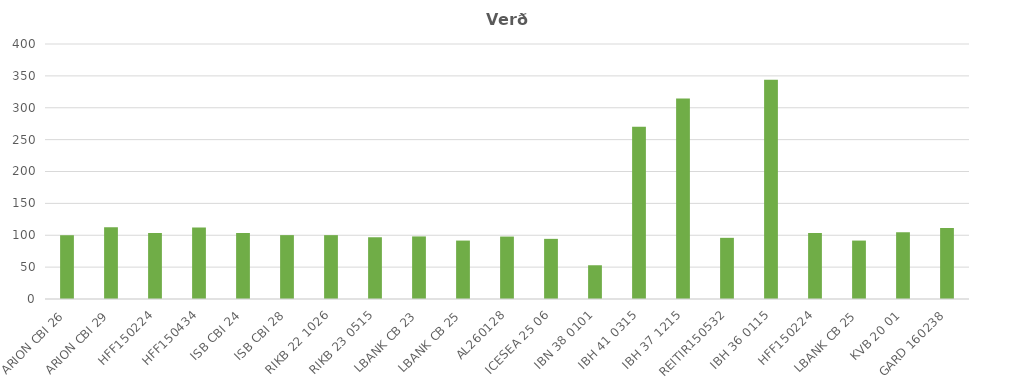
| Category | Verð |
|---|---|
| ARION CBI 26 | 100.038 |
| ARION CBI 29 | 112.513 |
| HFF150224 | 103.555 |
| HFF150434 | 112.057 |
| ISB CBI 24 | 103.497 |
| ISB CBI 28 | 100.196 |
| RIKB 22 1026 | 100.172 |
| RIKB 23 0515 | 96.86 |
| LBANK CB 23 | 98.145 |
| LBANK CB 25 | 91.652 |
| AL260128 | 97.932 |
| ICESEA 25 06 | 94.346 |
| IBN 38 0101 | 52.941 |
| IBH 41 0315 | 270.159 |
| IBH 37 1215 | 314.342 |
| REITIR150532 | 95.948 |
| IBH 36 0115 | 343.925 |
| HFF150224 | 103.555 |
| LBANK CB 25 | 91.652 |
| KVB 20 01 | 104.798 |
| GARD 160238 | 111.468 |